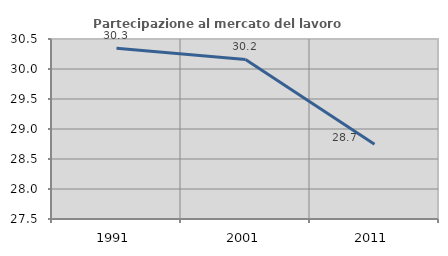
| Category | Partecipazione al mercato del lavoro  femminile |
|---|---|
| 1991.0 | 30.345 |
| 2001.0 | 30.159 |
| 2011.0 | 28.748 |